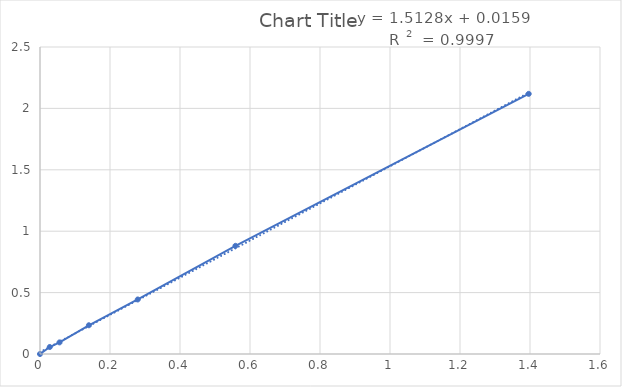
| Category | Series 0 |
|---|---|
| 0.0 | 0 |
| 0.027925 | 0.057 |
| 0.05585 | 0.095 |
| 0.139625 | 0.234 |
| 0.27925 | 0.444 |
| 0.5585 | 0.881 |
| 1.39625 | 2.118 |